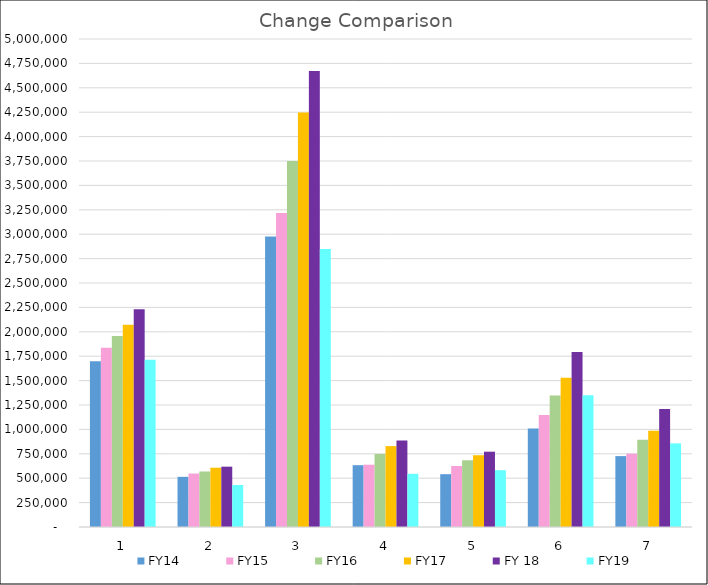
| Category | FY14 | FY15 | FY16 | FY17 | FY 18 | FY19 |
|---|---|---|---|---|---|---|
| 0 | 1697413.69 | 1835663.78 | 1956207.25 | 2071290.66 | 2229829.3 | 1713373.57 |
| 1 | 514097.08 | 547790.16 | 568881.38 | 607325.72 | 618106.66 | 430563.91 |
| 2 | 2975568.42 | 3217944.64 | 3749759.46 | 4247363.68 | 4672464.47 | 2847736.43 |
| 3 | 633266.07 | 638402.21 | 747902.56 | 828732.03 | 885071.99 | 545015.8 |
| 4 | 541250.65 | 625195.14 | 683574.65 | 735454.7 | 771557.81 | 581896.17 |
| 5 | 1009130.99 | 1146939.29 | 1347396.33 | 1529829.21 | 1792550.87 | 1350365.78 |
| 6 | 726546.4 | 751460.76 | 893765.74 | 986386.67 | 1209719.48 | 857099.51 |